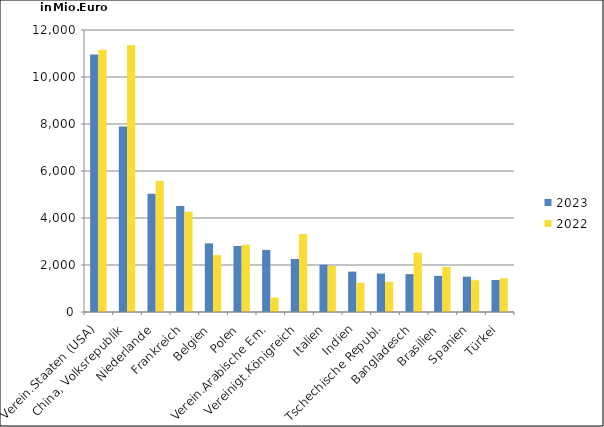
| Category | 2023 | 2022 |
|---|---|---|
| Verein.Staaten (USA) | 10955.426 | 11163.247 |
| China, Volksrepublik | 7891.605 | 11363.687 |
| Niederlande | 5036.218 | 5574.153 |
| Frankreich | 4510.29 | 4264 |
| Belgien | 2919.477 | 2420.441 |
| Polen | 2807.956 | 2863.012 |
| Verein.Arabische Em. | 2641.786 | 608.41 |
| Vereinigt.Königreich | 2255.305 | 3314.575 |
| Italien | 2014.331 | 1956.001 |
| Indien | 1719.052 | 1246.986 |
| Tschechische Republ. | 1638.208 | 1285.967 |
| Bangladesch | 1611.336 | 2522.492 |
| Brasilien | 1539.67 | 1919.623 |
| Spanien | 1503.564 | 1354.548 |
| Türkei | 1361.516 | 1433.669 |